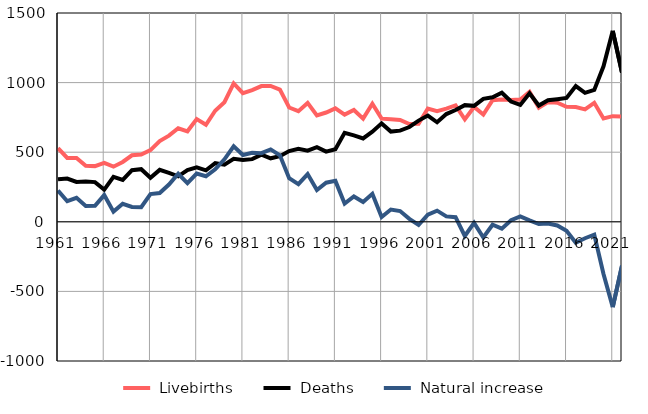
| Category |  Livebirths |  Deaths |  Natural increase |
|---|---|---|---|
| 1961.0 | 530 | 305 | 225 |
| 1962.0 | 459 | 311 | 148 |
| 1963.0 | 458 | 286 | 172 |
| 1964.0 | 402 | 289 | 113 |
| 1965.0 | 400 | 285 | 115 |
| 1966.0 | 423 | 231 | 192 |
| 1967.0 | 396 | 323 | 73 |
| 1968.0 | 430 | 301 | 129 |
| 1969.0 | 478 | 371 | 107 |
| 1970.0 | 483 | 378 | 105 |
| 1971.0 | 515 | 316 | 199 |
| 1972.0 | 580 | 373 | 207 |
| 1973.0 | 619 | 351 | 268 |
| 1974.0 | 672 | 327 | 345 |
| 1975.0 | 650 | 372 | 278 |
| 1976.0 | 738 | 391 | 347 |
| 1977.0 | 697 | 370 | 327 |
| 1978.0 | 798 | 421 | 377 |
| 1979.0 | 859 | 410 | 449 |
| 1980.0 | 994 | 452 | 542 |
| 1981.0 | 924 | 444 | 480 |
| 1982.0 | 946 | 450 | 496 |
| 1983.0 | 975 | 482 | 493 |
| 1984.0 | 976 | 456 | 520 |
| 1985.0 | 949 | 471 | 478 |
| 1986.0 | 821 | 508 | 313 |
| 1987.0 | 795 | 525 | 270 |
| 1988.0 | 854 | 511 | 343 |
| 1989.0 | 764 | 536 | 228 |
| 1990.0 | 785 | 504 | 281 |
| 1991.0 | 815 | 521 | 294 |
| 1992.0 | 770 | 639 | 131 |
| 1993.0 | 803 | 621 | 182 |
| 1994.0 | 741 | 599 | 142 |
| 1995.0 | 848 | 647 | 201 |
| 1996.0 | 741 | 707 | 34 |
| 1997.0 | 736 | 648 | 88 |
| 1998.0 | 732 | 655 | 77 |
| 1999.0 | 702 | 681 | 21 |
| 2000.0 | 704 | 727 | -23 |
| 2001.0 | 814 | 763 | 51 |
| 2002.0 | 795 | 715 | 80 |
| 2003.0 | 813 | 774 | 39 |
| 2004.0 | 836 | 803 | 33 |
| 2005.0 | 736 | 838 | -102 |
| 2006.0 | 825 | 833 | -8 |
| 2007.0 | 770 | 883 | -113 |
| 2008.0 | 874 | 895 | -21 |
| 2009.0 | 878 | 927 | -49 |
| 2010.0 | 875 | 864 | 11 |
| 2011.0 | 879 | 840 | 39 |
| 2012.0 | 934 | 924 | 10 |
| 2013.0 | 819 | 835 | -16 |
| 2014.0 | 861 | 873 | -12 |
| 2015.0 | 855 | 881 | -26 |
| 2016.0 | 826 | 890 | -64 |
| 2017.0 | 825 | 975 | -150 |
| 2018.0 | 808 | 926 | -118 |
| 2019.0 | 855 | 947 | -92 |
| 2020.0 | 742 | 1117 | -375 |
| 2021.0 | 759 | 1372 | -613 |
| 2022.0 | 757 | 1072 | -315 |